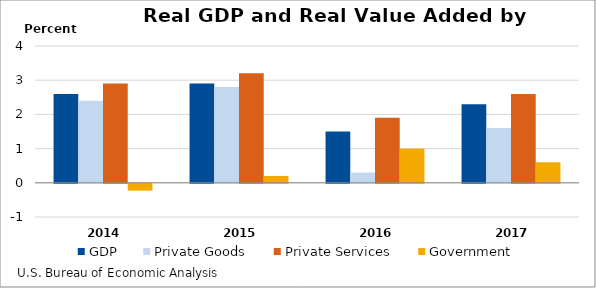
| Category | GDP | Private Goods | Private Services | Government |
|---|---|---|---|---|
| 2014.0 | 2.6 | 2.4 | 2.9 | -0.2 |
| 2015.0 | 2.9 | 2.8 | 3.2 | 0.2 |
| 2016.0 | 1.5 | 0.3 | 1.9 | 1 |
| 2017.0 | 2.3 | 1.6 | 2.6 | 0.6 |